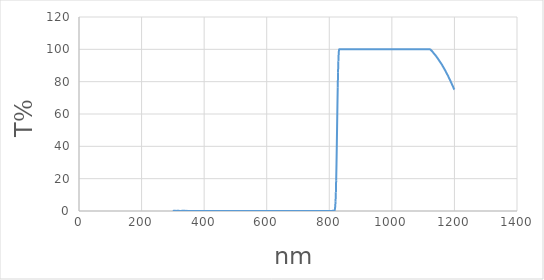
| Category | Series 0 |
|---|---|
| 1200.0 | 75.11 |
| 1199.0 | 75.38 |
| 1198.0 | 75.76 |
| 1197.0 | 76.19 |
| 1196.0 | 76.68 |
| 1195.0 | 77.16 |
| 1194.0 | 77.6 |
| 1193.0 | 78 |
| 1192.0 | 78.41 |
| 1191.0 | 78.85 |
| 1190.0 | 79.27 |
| 1189.0 | 79.7 |
| 1188.0 | 80.12 |
| 1187.0 | 80.54 |
| 1186.0 | 80.95 |
| 1185.0 | 81.37 |
| 1184.0 | 81.77 |
| 1183.0 | 82.16 |
| 1182.0 | 82.57 |
| 1181.0 | 82.99 |
| 1180.0 | 83.39 |
| 1179.0 | 83.79 |
| 1178.0 | 84.16 |
| 1177.0 | 84.52 |
| 1176.0 | 84.86 |
| 1175.0 | 85.22 |
| 1174.0 | 85.57 |
| 1173.0 | 85.95 |
| 1172.0 | 86.32 |
| 1171.0 | 86.73 |
| 1170.0 | 87.1 |
| 1169.0 | 87.46 |
| 1168.0 | 87.79 |
| 1167.0 | 88.13 |
| 1166.0 | 88.46 |
| 1165.0 | 88.8 |
| 1164.0 | 89.14 |
| 1163.0 | 89.48 |
| 1162.0 | 89.83 |
| 1161.0 | 90.17 |
| 1160.0 | 90.51 |
| 1159.0 | 90.83 |
| 1158.0 | 91.12 |
| 1157.0 | 91.41 |
| 1156.0 | 91.69 |
| 1155.0 | 91.97 |
| 1154.0 | 92.25 |
| 1153.0 | 92.54 |
| 1152.0 | 92.83 |
| 1151.0 | 93.12 |
| 1150.0 | 93.42 |
| 1149.0 | 93.69 |
| 1148.0 | 93.97 |
| 1147.0 | 94.25 |
| 1146.0 | 94.54 |
| 1145.0 | 94.83 |
| 1144.0 | 95.1 |
| 1143.0 | 95.37 |
| 1142.0 | 95.64 |
| 1141.0 | 95.9 |
| 1140.0 | 96.15 |
| 1139.0 | 96.38 |
| 1138.0 | 96.63 |
| 1137.0 | 96.85 |
| 1136.0 | 97.07 |
| 1135.0 | 97.3 |
| 1134.0 | 97.53 |
| 1133.0 | 97.78 |
| 1132.0 | 98.04 |
| 1131.0 | 98.28 |
| 1130.0 | 98.52 |
| 1129.0 | 98.75 |
| 1128.0 | 98.96 |
| 1127.0 | 99.15 |
| 1126.0 | 99.34 |
| 1125.0 | 99.51 |
| 1124.0 | 99.71 |
| 1123.0 | 99.89 |
| 1122.0 | 100 |
| 1121.0 | 100 |
| 1120.0 | 100 |
| 1119.0 | 100 |
| 1118.0 | 100 |
| 1117.0 | 100 |
| 1116.0 | 100 |
| 1115.0 | 100 |
| 1114.0 | 100 |
| 1113.0 | 100 |
| 1112.0 | 100 |
| 1111.0 | 100 |
| 1110.0 | 100 |
| 1109.0 | 100 |
| 1108.0 | 100 |
| 1107.0 | 100 |
| 1106.0 | 100 |
| 1105.0 | 100 |
| 1104.0 | 100 |
| 1103.0 | 100 |
| 1102.0 | 100 |
| 1101.0 | 100 |
| 1100.0 | 100 |
| 1099.0 | 100 |
| 1098.0 | 100 |
| 1097.0 | 100 |
| 1096.0 | 100 |
| 1095.0 | 100 |
| 1094.0 | 100 |
| 1093.0 | 100 |
| 1092.0 | 100 |
| 1091.0 | 100 |
| 1090.0 | 100 |
| 1089.0 | 100 |
| 1088.0 | 100 |
| 1087.0 | 100 |
| 1086.0 | 100 |
| 1085.0 | 100 |
| 1084.0 | 100 |
| 1083.0 | 100 |
| 1082.0 | 100 |
| 1081.0 | 100 |
| 1080.0 | 100 |
| 1079.0 | 100 |
| 1078.0 | 100 |
| 1077.0 | 100 |
| 1076.0 | 100 |
| 1075.0 | 100 |
| 1074.0 | 100 |
| 1073.0 | 100 |
| 1072.0 | 100 |
| 1071.0 | 100 |
| 1070.0 | 100 |
| 1069.0 | 100 |
| 1068.0 | 100 |
| 1067.0 | 100 |
| 1066.0 | 100 |
| 1065.0 | 100 |
| 1064.0 | 100 |
| 1063.0 | 100 |
| 1062.0 | 100 |
| 1061.0 | 100 |
| 1060.0 | 100 |
| 1059.0 | 100 |
| 1058.0 | 100 |
| 1057.0 | 100 |
| 1056.0 | 100 |
| 1055.0 | 100 |
| 1054.0 | 100 |
| 1053.0 | 100 |
| 1052.0 | 100 |
| 1051.0 | 100 |
| 1050.0 | 100 |
| 1049.0 | 100 |
| 1048.0 | 100 |
| 1047.0 | 100 |
| 1046.0 | 100 |
| 1045.0 | 100 |
| 1044.0 | 100 |
| 1043.0 | 100 |
| 1042.0 | 100 |
| 1041.0 | 100 |
| 1040.0 | 100 |
| 1039.0 | 100 |
| 1038.0 | 100 |
| 1037.0 | 100 |
| 1036.0 | 100 |
| 1035.0 | 100 |
| 1034.0 | 100 |
| 1033.0 | 100 |
| 1032.0 | 100 |
| 1031.0 | 100 |
| 1030.0 | 100 |
| 1029.0 | 100 |
| 1028.0 | 100 |
| 1027.0 | 100 |
| 1026.0 | 100 |
| 1025.0 | 100 |
| 1024.0 | 100 |
| 1023.0 | 100 |
| 1022.0 | 100 |
| 1021.0 | 100 |
| 1020.0 | 100 |
| 1019.0 | 100 |
| 1018.0 | 100 |
| 1017.0 | 100 |
| 1016.0 | 100 |
| 1015.0 | 100 |
| 1014.0 | 100 |
| 1013.0 | 100 |
| 1012.0 | 100 |
| 1011.0 | 100 |
| 1010.0 | 100 |
| 1009.0 | 100 |
| 1008.0 | 100 |
| 1007.0 | 100 |
| 1006.0 | 100 |
| 1005.0 | 100 |
| 1004.0 | 100 |
| 1003.0 | 100 |
| 1002.0 | 100 |
| 1001.0 | 100 |
| 1000.0 | 100 |
| 999.0 | 100 |
| 998.0 | 100 |
| 997.0 | 100 |
| 996.0 | 100 |
| 995.0 | 100 |
| 994.0 | 100 |
| 993.0 | 100 |
| 992.0 | 100 |
| 991.0 | 100 |
| 990.0 | 100 |
| 989.0 | 100 |
| 988.0 | 100 |
| 987.0 | 100 |
| 986.0 | 100 |
| 985.0 | 100 |
| 984.0 | 100 |
| 983.0 | 100 |
| 982.0 | 100 |
| 981.0 | 100 |
| 980.0 | 100 |
| 979.0 | 100 |
| 978.0 | 100 |
| 977.0 | 100 |
| 976.0 | 100 |
| 975.0 | 100 |
| 974.0 | 100 |
| 973.0 | 100 |
| 972.0 | 100 |
| 971.0 | 100 |
| 970.0 | 100 |
| 969.0 | 100 |
| 968.0 | 100 |
| 967.0 | 100 |
| 966.0 | 100 |
| 965.0 | 100 |
| 964.0 | 100 |
| 963.0 | 100 |
| 962.0 | 100 |
| 961.0 | 100 |
| 960.0 | 100 |
| 959.0 | 100 |
| 958.0 | 100 |
| 957.0 | 100 |
| 956.0 | 100 |
| 955.0 | 100 |
| 954.0 | 100 |
| 953.0 | 100 |
| 952.0 | 100 |
| 951.0 | 100 |
| 950.0 | 100 |
| 949.0 | 100 |
| 948.0 | 100 |
| 947.0 | 100 |
| 946.0 | 100 |
| 945.0 | 100 |
| 944.0 | 100 |
| 943.0 | 100 |
| 942.0 | 100 |
| 941.0 | 100 |
| 940.0 | 100 |
| 939.0 | 100 |
| 938.0 | 100 |
| 937.0 | 100 |
| 936.0 | 100 |
| 935.0 | 100 |
| 934.0 | 100 |
| 933.0 | 100 |
| 932.0 | 100 |
| 931.0 | 100 |
| 930.0 | 100 |
| 929.0 | 100 |
| 928.0 | 100 |
| 927.0 | 100 |
| 926.0 | 100 |
| 925.0 | 100 |
| 924.0 | 100 |
| 923.0 | 100 |
| 922.0 | 100 |
| 921.0 | 100 |
| 920.0 | 100 |
| 919.0 | 100 |
| 918.0 | 100 |
| 917.0 | 100 |
| 916.0 | 100 |
| 915.0 | 100 |
| 914.0 | 100 |
| 913.0 | 100 |
| 912.0 | 100 |
| 911.0 | 100 |
| 910.0 | 100 |
| 909.0 | 100 |
| 908.0 | 100 |
| 907.0 | 100 |
| 906.0 | 100 |
| 905.0 | 100 |
| 904.0 | 100 |
| 903.0 | 100 |
| 902.0 | 100 |
| 901.0 | 100 |
| 900.0 | 100 |
| 899.0 | 100 |
| 898.0 | 100 |
| 897.0 | 100 |
| 896.0 | 100 |
| 895.0 | 100 |
| 894.0 | 100 |
| 893.0 | 100 |
| 892.0 | 100 |
| 891.0 | 100 |
| 890.0 | 100 |
| 889.0 | 100 |
| 888.0 | 100 |
| 887.0 | 100 |
| 886.0 | 100 |
| 885.0 | 100 |
| 884.0 | 100 |
| 883.0 | 100 |
| 882.0 | 100 |
| 881.0 | 100 |
| 880.0 | 100 |
| 879.0 | 100 |
| 878.0 | 100 |
| 877.0 | 100 |
| 876.0 | 100 |
| 875.0 | 100 |
| 874.0 | 100 |
| 873.0 | 100 |
| 872.0 | 100 |
| 871.0 | 100 |
| 870.0 | 100 |
| 869.0 | 100 |
| 868.0 | 100 |
| 867.0 | 100 |
| 866.0 | 100 |
| 865.0 | 100 |
| 864.0 | 100 |
| 863.0 | 100 |
| 862.0 | 100 |
| 861.0 | 100 |
| 860.0 | 100 |
| 859.0 | 100 |
| 858.0 | 100 |
| 857.0 | 100 |
| 856.0 | 100 |
| 855.0 | 100 |
| 854.0 | 100 |
| 853.0 | 100 |
| 852.0 | 100 |
| 851.0 | 100 |
| 850.0 | 100 |
| 849.0 | 100 |
| 848.0 | 100 |
| 847.0 | 100 |
| 846.0 | 100 |
| 845.0 | 100 |
| 844.0 | 100 |
| 843.0 | 100 |
| 842.0 | 100 |
| 841.0 | 100 |
| 840.0 | 100 |
| 839.0 | 100 |
| 838.0 | 100 |
| 837.0 | 100 |
| 836.0 | 100 |
| 835.0 | 100 |
| 834.0 | 100 |
| 833.0 | 100 |
| 832.0 | 100 |
| 831.0 | 99.41 |
| 830.0 | 97.12 |
| 829.0 | 92.55 |
| 828.0 | 85.81 |
| 827.0 | 76.49 |
| 826.0 | 65.11 |
| 825.0 | 52.65 |
| 824.0 | 40.26 |
| 823.0 | 28.65 |
| 822.0 | 18.74 |
| 821.0 | 11.26 |
| 820.0 | 6.04 |
| 819.0 | 2.87 |
| 818.0 | 1.2 |
| 817.0 | 0.4 |
| 816.0 | 0.19 |
| 815.0 | 0.2 |
| 814.0 | 0.2 |
| 813.0 | 0.2 |
| 812.0 | 0.16 |
| 811.0 | 0.12 |
| 810.0 | 0.09 |
| 809.0 | 0.08 |
| 808.0 | 0.07 |
| 807.0 | 0.06 |
| 806.0 | 0.05 |
| 805.0 | 0.04 |
| 804.0 | 0.04 |
| 803.0 | 0.04 |
| 802.0 | 0.04 |
| 801.0 | 0.03 |
| 800.0 | 0.02 |
| 799.0 | 0.02 |
| 798.0 | 0.02 |
| 797.0 | 0.01 |
| 796.0 | 0.01 |
| 795.0 | 0.01 |
| 794.0 | 0.02 |
| 793.0 | 0.02 |
| 792.0 | 0.02 |
| 791.0 | 0.02 |
| 790.0 | 0.02 |
| 789.0 | 0.02 |
| 788.0 | 0.02 |
| 787.0 | 0.01 |
| 786.0 | 0.01 |
| 785.0 | 0.01 |
| 784.0 | 0.01 |
| 783.0 | 0.01 |
| 782.0 | 0.01 |
| 781.0 | 0.01 |
| 780.0 | 0.01 |
| 779.0 | 0.01 |
| 778.0 | 0.01 |
| 777.0 | 0.01 |
| 776.0 | 0 |
| 775.0 | 0 |
| 774.0 | 0 |
| 773.0 | 0.01 |
| 772.0 | 0.01 |
| 771.0 | 0.02 |
| 770.0 | 0.02 |
| 769.0 | 0.02 |
| 768.0 | 0.02 |
| 767.0 | 0.01 |
| 766.0 | 0.01 |
| 765.0 | 0.01 |
| 764.0 | 0.01 |
| 763.0 | 0.01 |
| 762.0 | 0.01 |
| 761.0 | 0.01 |
| 760.0 | 0.01 |
| 759.0 | 0.01 |
| 758.0 | 0.01 |
| 757.0 | 0.01 |
| 756.0 | 0.01 |
| 755.0 | 0.01 |
| 754.0 | 0.01 |
| 753.0 | 0.01 |
| 752.0 | 0.02 |
| 751.0 | 0.02 |
| 750.0 | 0.02 |
| 749.0 | 0.01 |
| 748.0 | 0.01 |
| 747.0 | 0.01 |
| 746.0 | 0.01 |
| 745.0 | 0 |
| 744.0 | 0 |
| 743.0 | 0.01 |
| 742.0 | 0.01 |
| 741.0 | 0.01 |
| 740.0 | 0.02 |
| 739.0 | 0.02 |
| 738.0 | 0.01 |
| 737.0 | 0.01 |
| 736.0 | 0.01 |
| 735.0 | 0.01 |
| 734.0 | 0.01 |
| 733.0 | 0.01 |
| 732.0 | 0.02 |
| 731.0 | 0.02 |
| 730.0 | 0.01 |
| 729.0 | 0.01 |
| 728.0 | 0.01 |
| 727.0 | 0.01 |
| 726.0 | 0.01 |
| 725.0 | 0.01 |
| 724.0 | 0.01 |
| 723.0 | 0.01 |
| 722.0 | 0.01 |
| 721.0 | 0.01 |
| 720.0 | 0.01 |
| 719.0 | 0.01 |
| 718.0 | 0.01 |
| 717.0 | 0.01 |
| 716.0 | 0.01 |
| 715.0 | 0.01 |
| 714.0 | 0.01 |
| 713.0 | 0.01 |
| 712.0 | 0.01 |
| 711.0 | 0.01 |
| 710.0 | 0.01 |
| 709.0 | 0.01 |
| 708.0 | 0.01 |
| 707.0 | 0.01 |
| 706.0 | 0.01 |
| 705.0 | 0.01 |
| 704.0 | 0.01 |
| 703.0 | 0.01 |
| 702.0 | 0.01 |
| 701.0 | 0.01 |
| 700.0 | 0.01 |
| 699.0 | 0.01 |
| 698.0 | 0.01 |
| 697.0 | 0.01 |
| 696.0 | 0.01 |
| 695.0 | 0.01 |
| 694.0 | 0.01 |
| 693.0 | 0.01 |
| 692.0 | 0 |
| 691.0 | 0 |
| 690.0 | 0 |
| 689.0 | 0 |
| 688.0 | 0 |
| 687.0 | 0.01 |
| 686.0 | 0.01 |
| 685.0 | 0 |
| 684.0 | 0.01 |
| 683.0 | 0.01 |
| 682.0 | 0.01 |
| 681.0 | 0.01 |
| 680.0 | 0.01 |
| 679.0 | 0 |
| 678.0 | 0.01 |
| 677.0 | 0.01 |
| 676.0 | 0 |
| 675.0 | 0.01 |
| 674.0 | 0 |
| 673.0 | 0 |
| 672.0 | 0 |
| 671.0 | 0 |
| 670.0 | 0 |
| 669.0 | 0 |
| 668.0 | 0 |
| 667.0 | 0 |
| 666.0 | 0.01 |
| 665.0 | 0.01 |
| 664.0 | 0.01 |
| 663.0 | 0.02 |
| 662.0 | 0.02 |
| 661.0 | 0.02 |
| 660.0 | 0.02 |
| 659.0 | 0.03 |
| 658.0 | 0.03 |
| 657.0 | 0.03 |
| 656.0 | 0.03 |
| 655.0 | 0.02 |
| 654.0 | 0.02 |
| 653.0 | 0.02 |
| 652.0 | 0.02 |
| 651.0 | 0.01 |
| 650.0 | 0.01 |
| 649.0 | 0.01 |
| 648.0 | 0.01 |
| 647.0 | 0.01 |
| 646.0 | 0.01 |
| 645.0 | 0.01 |
| 644.0 | 0.01 |
| 643.0 | 0.01 |
| 642.0 | 0.01 |
| 641.0 | 0.01 |
| 640.0 | 0.01 |
| 639.0 | 0.01 |
| 638.0 | 0.01 |
| 637.0 | 0.01 |
| 636.0 | 0.01 |
| 635.0 | 0.01 |
| 634.0 | 0.01 |
| 633.0 | 0.01 |
| 632.0 | 0.01 |
| 631.0 | 0.01 |
| 630.0 | 0.01 |
| 629.0 | 0.02 |
| 628.0 | 0.02 |
| 627.0 | 0.02 |
| 626.0 | 0.02 |
| 625.0 | 0.01 |
| 624.0 | 0.01 |
| 623.0 | 0.01 |
| 622.0 | 0.01 |
| 621.0 | 0.01 |
| 620.0 | 0.01 |
| 619.0 | 0.02 |
| 618.0 | 0.01 |
| 617.0 | 0.01 |
| 616.0 | 0.01 |
| 615.0 | 0.01 |
| 614.0 | 0.01 |
| 613.0 | 0.01 |
| 612.0 | 0.01 |
| 611.0 | 0.01 |
| 610.0 | 0.01 |
| 609.0 | 0.01 |
| 608.0 | 0.01 |
| 607.0 | 0.02 |
| 606.0 | 0.02 |
| 605.0 | 0.02 |
| 604.0 | 0.02 |
| 603.0 | 0.02 |
| 602.0 | 0.02 |
| 601.0 | 0.02 |
| 600.0 | 0.01 |
| 599.0 | 0.01 |
| 598.0 | 0.01 |
| 597.0 | 0.01 |
| 596.0 | 0.01 |
| 595.0 | 0.01 |
| 594.0 | 0.01 |
| 593.0 | 0.01 |
| 592.0 | 0.01 |
| 591.0 | 0.01 |
| 590.0 | 0.01 |
| 589.0 | 0.01 |
| 588.0 | 0.01 |
| 587.0 | 0.01 |
| 586.0 | 0.01 |
| 585.0 | 0.01 |
| 584.0 | 0.01 |
| 583.0 | 0.01 |
| 582.0 | 0.01 |
| 581.0 | 0.01 |
| 580.0 | 0.01 |
| 579.0 | 0.01 |
| 578.0 | 0.01 |
| 577.0 | 0.01 |
| 576.0 | 0.01 |
| 575.0 | 0.01 |
| 574.0 | 0.02 |
| 573.0 | 0.02 |
| 572.0 | 0.01 |
| 571.0 | 0.01 |
| 570.0 | 0.01 |
| 569.0 | 0.01 |
| 568.0 | 0.01 |
| 567.0 | 0.01 |
| 566.0 | 0.01 |
| 565.0 | 0.01 |
| 564.0 | 0.01 |
| 563.0 | 0.01 |
| 562.0 | 0.01 |
| 561.0 | 0.01 |
| 560.0 | 0.01 |
| 559.0 | 0.01 |
| 558.0 | 0.01 |
| 557.0 | 0.01 |
| 556.0 | 0.01 |
| 555.0 | 0.01 |
| 554.0 | 0.01 |
| 553.0 | 0.01 |
| 552.0 | 0.01 |
| 551.0 | 0.01 |
| 550.0 | 0.01 |
| 549.0 | 0.01 |
| 548.0 | 0.01 |
| 547.0 | 0.01 |
| 546.0 | 0.01 |
| 545.0 | 0.01 |
| 544.0 | 0.01 |
| 543.0 | 0.01 |
| 542.0 | 0.01 |
| 541.0 | 0.01 |
| 540.0 | 0.01 |
| 539.0 | 0.01 |
| 538.0 | 0.01 |
| 537.0 | 0.01 |
| 536.0 | 0.01 |
| 535.0 | 0.01 |
| 534.0 | 0.01 |
| 533.0 | 0.01 |
| 532.0 | 0.02 |
| 531.0 | 0.02 |
| 530.0 | 0.02 |
| 529.0 | 0.01 |
| 528.0 | 0.01 |
| 527.0 | 0.01 |
| 526.0 | 0.01 |
| 525.0 | 0.01 |
| 524.0 | 0.01 |
| 523.0 | 0.01 |
| 522.0 | 0.01 |
| 521.0 | 0.01 |
| 520.0 | 0.01 |
| 519.0 | 0.01 |
| 518.0 | 0.01 |
| 517.0 | 0.01 |
| 516.0 | 0.01 |
| 515.0 | 0.01 |
| 514.0 | 0.01 |
| 513.0 | 0.01 |
| 512.0 | 0.02 |
| 511.0 | 0.02 |
| 510.0 | 0.01 |
| 509.0 | 0.01 |
| 508.0 | 0.01 |
| 507.0 | 0.01 |
| 506.0 | 0.01 |
| 505.0 | 0.01 |
| 504.0 | 0.01 |
| 503.0 | 0.01 |
| 502.0 | 0.01 |
| 501.0 | 0.01 |
| 500.0 | 0.01 |
| 499.0 | 0.01 |
| 498.0 | 0.01 |
| 497.0 | 0.01 |
| 496.0 | 0.01 |
| 495.0 | 0.01 |
| 494.0 | 0.01 |
| 493.0 | 0.01 |
| 492.0 | 0.01 |
| 491.0 | 0.01 |
| 490.0 | 0.01 |
| 489.0 | 0.01 |
| 488.0 | 0.01 |
| 487.0 | 0.01 |
| 486.0 | 0.01 |
| 485.0 | 0.01 |
| 484.0 | 0.01 |
| 483.0 | 0.01 |
| 482.0 | 0.01 |
| 481.0 | 0.01 |
| 480.0 | 0.01 |
| 479.0 | 0.01 |
| 478.0 | 0.01 |
| 477.0 | 0.01 |
| 476.0 | 0.01 |
| 475.0 | 0.01 |
| 474.0 | 0.02 |
| 473.0 | 0.02 |
| 472.0 | 0.02 |
| 471.0 | 0.03 |
| 470.0 | 0.03 |
| 469.0 | 0.03 |
| 468.0 | 0.03 |
| 467.0 | 0.03 |
| 466.0 | 0.03 |
| 465.0 | 0.03 |
| 464.0 | 0.03 |
| 463.0 | 0.03 |
| 462.0 | 0.03 |
| 461.0 | 0.03 |
| 460.0 | 0.02 |
| 459.0 | 0.02 |
| 458.0 | 0.02 |
| 457.0 | 0.02 |
| 456.0 | 0.02 |
| 455.0 | 0.02 |
| 454.0 | 0.02 |
| 453.0 | 0.01 |
| 452.0 | 0.01 |
| 451.0 | 0.01 |
| 450.0 | 0 |
| 449.0 | 0.01 |
| 448.0 | 0.01 |
| 447.0 | 0.02 |
| 446.0 | 0.01 |
| 445.0 | 0.01 |
| 444.0 | 0.01 |
| 443.0 | 0.01 |
| 442.0 | 0 |
| 441.0 | 0 |
| 440.0 | 0.01 |
| 439.0 | 0.01 |
| 438.0 | 0.02 |
| 437.0 | 0.02 |
| 436.0 | 0.02 |
| 435.0 | 0.02 |
| 434.0 | 0.01 |
| 433.0 | 0.01 |
| 432.0 | 0.01 |
| 431.0 | 0.01 |
| 430.0 | 0.02 |
| 429.0 | 0.02 |
| 428.0 | 0.02 |
| 427.0 | 0.02 |
| 426.0 | 0.01 |
| 425.0 | 0.01 |
| 424.0 | 0.01 |
| 423.0 | 0.01 |
| 422.0 | 0.01 |
| 421.0 | 0.02 |
| 420.0 | 0.02 |
| 419.0 | 0.02 |
| 418.0 | 0.01 |
| 417.0 | 0.02 |
| 416.0 | 0.02 |
| 415.0 | 0.02 |
| 414.0 | 0.02 |
| 413.0 | 0.02 |
| 412.0 | 0.02 |
| 411.0 | 0.02 |
| 410.0 | 0.02 |
| 409.0 | 0.03 |
| 408.0 | 0.03 |
| 407.0 | 0.03 |
| 406.0 | 0.03 |
| 405.0 | 0.03 |
| 404.0 | 0.04 |
| 403.0 | 0.03 |
| 402.0 | 0.03 |
| 401.0 | 0.03 |
| 400.0 | 0.03 |
| 399.0 | 0.03 |
| 398.0 | 0.02 |
| 397.0 | 0.02 |
| 396.0 | 0.02 |
| 395.0 | 0.02 |
| 394.0 | 0.02 |
| 393.0 | 0.01 |
| 392.0 | 0.01 |
| 391.0 | 0.01 |
| 390.0 | 0.02 |
| 389.0 | 0.01 |
| 388.0 | 0.02 |
| 387.0 | 0.02 |
| 386.0 | 0.01 |
| 385.0 | 0.02 |
| 384.0 | 0.02 |
| 383.0 | 0.02 |
| 382.0 | 0.02 |
| 381.0 | 0.03 |
| 380.0 | 0.03 |
| 379.0 | 0.03 |
| 378.0 | 0.04 |
| 377.0 | 0.03 |
| 376.0 | 0.01 |
| 375.0 | 0.01 |
| 374.0 | 0 |
| 373.0 | 0.01 |
| 372.0 | 0.01 |
| 371.0 | 0.01 |
| 370.0 | 0.02 |
| 369.0 | 0.03 |
| 368.0 | 0.03 |
| 367.0 | 0.03 |
| 366.0 | 0.03 |
| 365.0 | 0.03 |
| 364.0 | 0.03 |
| 363.0 | 0.02 |
| 362.0 | 0.02 |
| 361.0 | 0.03 |
| 360.0 | 0.02 |
| 359.0 | 0.01 |
| 358.0 | 0.01 |
| 357.0 | 0 |
| 356.0 | 0 |
| 355.0 | 0.01 |
| 354.0 | 0.02 |
| 353.0 | 0.02 |
| 352.0 | 0.01 |
| 351.0 | 0.01 |
| 350.0 | 0.01 |
| 349.0 | 0.01 |
| 348.0 | 0.02 |
| 347.0 | 0.05 |
| 346.0 | 0.08 |
| 345.0 | 0.05 |
| 344.0 | 0.02 |
| 343.0 | 0.05 |
| 342.0 | 0.15 |
| 341.0 | 0.06 |
| 340.0 | 0.01 |
| 339.0 | 0.03 |
| 338.0 | 0.05 |
| 337.0 | 0.15 |
| 336.0 | 0.16 |
| 335.0 | 0.11 |
| 334.0 | 0.01 |
| 333.0 | 0.08 |
| 332.0 | 0.18 |
| 331.0 | 0.15 |
| 330.0 | 0.08 |
| 329.0 | 0.06 |
| 328.0 | 0.03 |
| 327.0 | 0.09 |
| 326.0 | 0.06 |
| 325.0 | 0.05 |
| 324.0 | 0.05 |
| 323.0 | 0.05 |
| 322.0 | 0.01 |
| 321.0 | 0.03 |
| 320.0 | 0.09 |
| 319.0 | 0.11 |
| 318.0 | 0.15 |
| 317.0 | 0.17 |
| 316.0 | 0.21 |
| 315.0 | 0.06 |
| 314.0 | 0.01 |
| 313.0 | 0.12 |
| 312.0 | 0.06 |
| 311.0 | 0.04 |
| 310.0 | 0.04 |
| 309.0 | 0.12 |
| 308.0 | 0.06 |
| 307.0 | 0 |
| 306.0 | 0.09 |
| 305.0 | 0.16 |
| 304.0 | 0.21 |
| 303.0 | 0.18 |
| 302.0 | 0.11 |
| 301.0 | 0.07 |
| 300.0 | 0.03 |